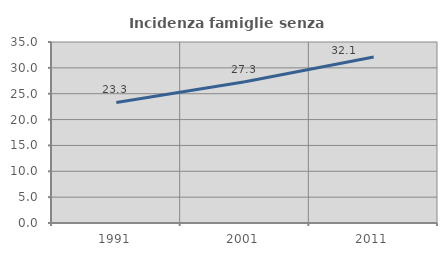
| Category | Incidenza famiglie senza nuclei |
|---|---|
| 1991.0 | 23.306 |
| 2001.0 | 27.295 |
| 2011.0 | 32.093 |